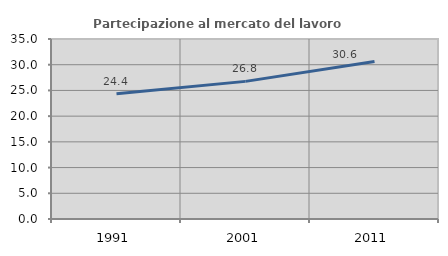
| Category | Partecipazione al mercato del lavoro  femminile |
|---|---|
| 1991.0 | 24.364 |
| 2001.0 | 26.761 |
| 2011.0 | 30.645 |